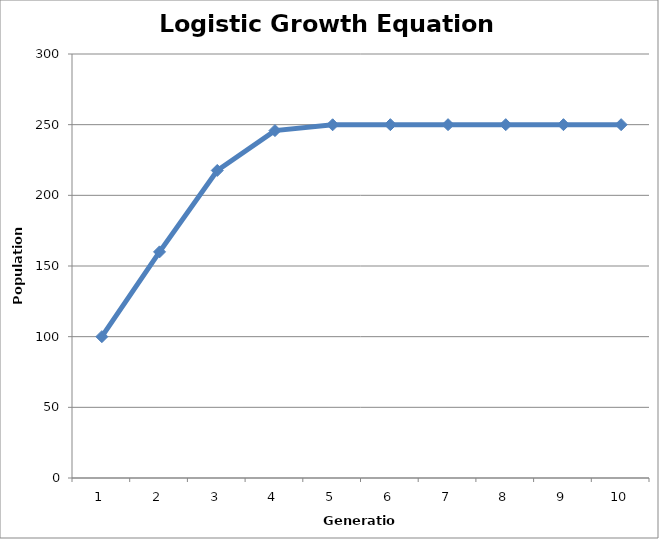
| Category | Generation |
|---|---|
| 1.0 | 100 |
| 2.0 | 160 |
| 3.0 | 217.6 |
| 4.0 | 245.801 |
| 5.0 | 249.929 |
| 6.0 | 250 |
| 7.0 | 250 |
| 8.0 | 250 |
| 9.0 | 250 |
| 10.0 | 250 |